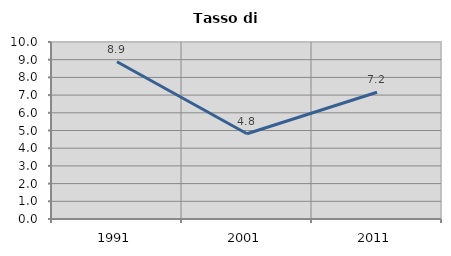
| Category | Tasso di disoccupazione   |
|---|---|
| 1991.0 | 8.887 |
| 2001.0 | 4.816 |
| 2011.0 | 7.161 |